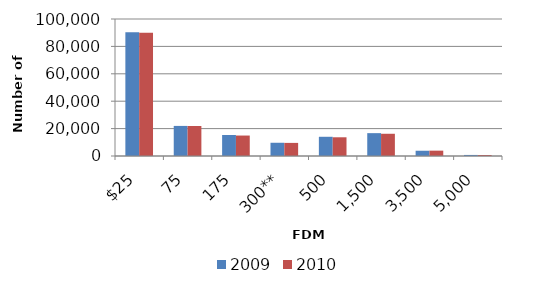
| Category | 2009 | 2010 |
|---|---|---|
| $25 | 90256 | 90029 |
| 75 | 21958 | 21914 |
| 175 | 15346 | 14931 |
| 300** | 9666 | 9561 |
| 500 | 14027 | 13662 |
| 1,500 | 16682 | 16228 |
| 3,500 | 3839 | 3907 |
| 5,000 | 772 | 735 |